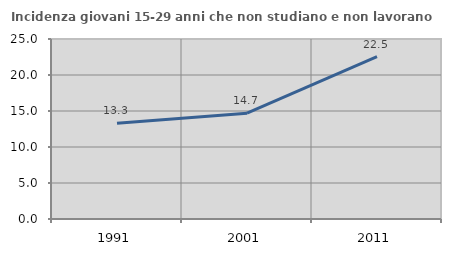
| Category | Incidenza giovani 15-29 anni che non studiano e non lavorano  |
|---|---|
| 1991.0 | 13.285 |
| 2001.0 | 14.691 |
| 2011.0 | 22.54 |